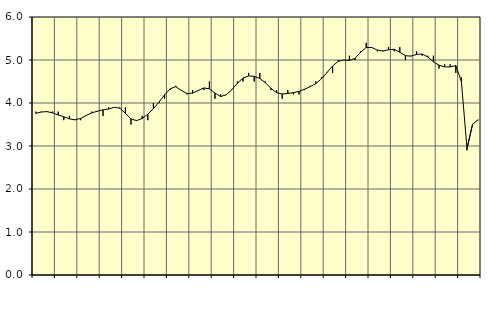
| Category | Piggar | Series 1 |
|---|---|---|
| nan | 3.8 | 3.76 |
| 1.0 | 3.8 | 3.79 |
| 1.0 | 3.8 | 3.8 |
| 1.0 | 3.8 | 3.77 |
| nan | 3.8 | 3.72 |
| 2.0 | 3.6 | 3.68 |
| 2.0 | 3.7 | 3.63 |
| 2.0 | 3.6 | 3.61 |
| nan | 3.6 | 3.64 |
| 3.0 | 3.7 | 3.71 |
| 3.0 | 3.8 | 3.77 |
| 3.0 | 3.8 | 3.81 |
| nan | 3.7 | 3.84 |
| 4.0 | 3.9 | 3.86 |
| 4.0 | 3.9 | 3.9 |
| 4.0 | 3.9 | 3.88 |
| nan | 3.9 | 3.76 |
| 5.0 | 3.5 | 3.63 |
| 5.0 | 3.6 | 3.59 |
| 5.0 | 3.7 | 3.64 |
| nan | 3.6 | 3.74 |
| 6.0 | 4 | 3.87 |
| 6.0 | 4 | 4.02 |
| 6.0 | 4.1 | 4.19 |
| nan | 4.3 | 4.33 |
| 7.0 | 4.4 | 4.38 |
| 7.0 | 4.3 | 4.29 |
| 7.0 | 4.2 | 4.22 |
| nan | 4.3 | 4.23 |
| 8.0 | 4.3 | 4.29 |
| 8.0 | 4.3 | 4.35 |
| 8.0 | 4.5 | 4.33 |
| nan | 4.1 | 4.23 |
| 9.0 | 4.2 | 4.15 |
| 9.0 | 4.2 | 4.19 |
| 9.0 | 4.3 | 4.31 |
| nan | 4.5 | 4.46 |
| 10.0 | 4.5 | 4.58 |
| 10.0 | 4.7 | 4.63 |
| 10.0 | 4.5 | 4.62 |
| nan | 4.7 | 4.57 |
| 11.0 | 4.5 | 4.47 |
| 11.0 | 4.3 | 4.34 |
| 11.0 | 4.3 | 4.24 |
| nan | 4.1 | 4.21 |
| 12.0 | 4.3 | 4.22 |
| 12.0 | 4.2 | 4.24 |
| 12.0 | 4.2 | 4.27 |
| nan | 4.3 | 4.32 |
| 13.0 | 4.4 | 4.38 |
| 13.0 | 4.5 | 4.45 |
| 13.0 | 4.6 | 4.56 |
| nan | 4.7 | 4.71 |
| 14.0 | 4.7 | 4.86 |
| 14.0 | 5 | 4.97 |
| 14.0 | 5 | 5 |
| nan | 5.1 | 4.99 |
| 15.0 | 5 | 5.04 |
| 15.0 | 5.2 | 5.18 |
| 15.0 | 5.4 | 5.29 |
| nan | 5.3 | 5.29 |
| 16.0 | 5.2 | 5.23 |
| 16.0 | 5.2 | 5.21 |
| 16.0 | 5.3 | 5.24 |
| nan | 5.2 | 5.25 |
| 17.0 | 5.3 | 5.18 |
| 17.0 | 5 | 5.1 |
| 17.0 | 5.1 | 5.09 |
| nan | 5.2 | 5.13 |
| 18.0 | 5.1 | 5.14 |
| 18.0 | 5.1 | 5.07 |
| 18.0 | 5.1 | 4.96 |
| nan | 4.8 | 4.88 |
| 19.0 | 4.9 | 4.84 |
| 19.0 | 4.9 | 4.84 |
| 19.0 | 4.7 | 4.87 |
| nan | 4.6 | 4.5 |
| 20.0 | 2.9 | 2.94 |
| 20.0 | 3.5 | 3.51 |
| 20.0 | 3.6 | 3.61 |